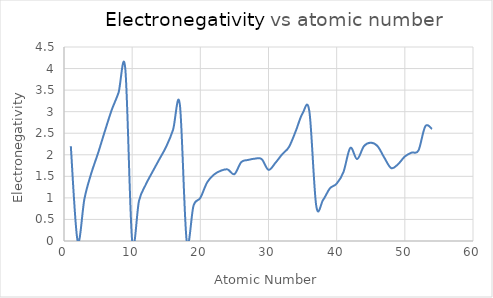
| Category | Series 0 |
|---|---|
| 1.0 | 2.2 |
| 2.0 | 0 |
| 3.0 | 0.98 |
| 4.0 | 1.57 |
| 5.0 | 2.04 |
| 6.0 | 2.55 |
| 7.0 | 3.04 |
| 8.0 | 3.44 |
| 9.0 | 3.98 |
| 10.0 | 0 |
| 11.0 | 0.93 |
| 12.0 | 1.31 |
| 13.0 | 1.61 |
| 14.0 | 1.9 |
| 15.0 | 2.19 |
| 16.0 | 2.58 |
| 17.0 | 3.16 |
| 18.0 | 0 |
| 19.0 | 0.82 |
| 20.0 | 1 |
| 21.0 | 1.36 |
| 22.0 | 1.54 |
| 23.0 | 1.63 |
| 24.0 | 1.66 |
| 25.0 | 1.55 |
| 26.0 | 1.83 |
| 27.0 | 1.88 |
| 28.0 | 1.91 |
| 29.0 | 1.9 |
| 30.0 | 1.65 |
| 31.0 | 1.81 |
| 32.0 | 2.01 |
| 33.0 | 2.18 |
| 34.0 | 2.55 |
| 35.0 | 2.96 |
| 36.0 | 3 |
| 37.0 | 0.82 |
| 38.0 | 0.95 |
| 39.0 | 1.22 |
| 40.0 | 1.33 |
| 41.0 | 1.6 |
| 42.0 | 2.16 |
| 43.0 | 1.9 |
| 44.0 | 2.2 |
| 45.0 | 2.28 |
| 46.0 | 2.2 |
| 47.0 | 1.93 |
| 48.0 | 1.69 |
| 49.0 | 1.78 |
| 50.0 | 1.96 |
| 51.0 | 2.05 |
| 52.0 | 2.1 |
| 53.0 | 2.66 |
| 54.0 | 2.6 |